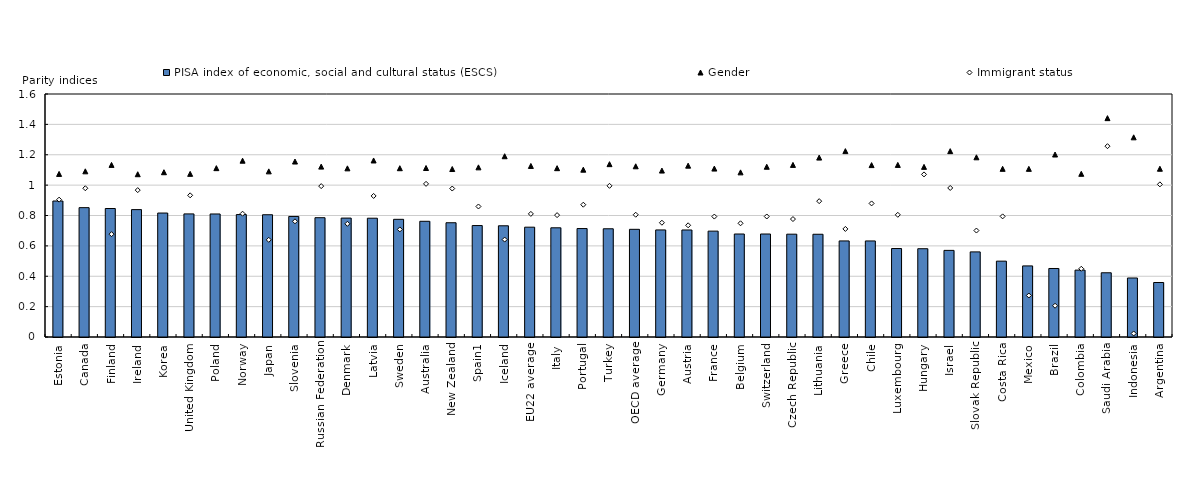
| Category | PISA index of economic, social and cultural status (ESCS) |
|---|---|
| Estonia | 0.895 |
| Canada | 0.852 |
| Finland | 0.846 |
| Ireland | 0.839 |
| Korea | 0.816 |
| United Kingdom | 0.811 |
| Poland | 0.81 |
| Norway | 0.806 |
| Japan | 0.805 |
| Slovenia | 0.794 |
| Russian Federation | 0.786 |
| Denmark | 0.783 |
| Latvia | 0.782 |
| Sweden | 0.775 |
| Australia | 0.762 |
| New Zealand | 0.752 |
| Spain1 | 0.734 |
| Iceland | 0.732 |
| EU22 average | 0.723 |
| Italy | 0.719 |
| Portugal | 0.714 |
| Turkey | 0.713 |
| OECD average | 0.709 |
| Germany | 0.705 |
| Austria | 0.705 |
| France | 0.697 |
| Belgium | 0.678 |
| Switzerland | 0.678 |
| Czech Republic | 0.677 |
| Lithuania | 0.676 |
| Greece | 0.633 |
| Chile | 0.632 |
| Luxembourg | 0.583 |
| Hungary | 0.581 |
| Israel | 0.57 |
| Slovak Republic | 0.56 |
| Costa Rica | 0.499 |
| Mexico | 0.468 |
| Brazil | 0.451 |
| Colombia | 0.44 |
| Saudi Arabia | 0.423 |
| Indonesia | 0.389 |
| Argentina | 0.359 |